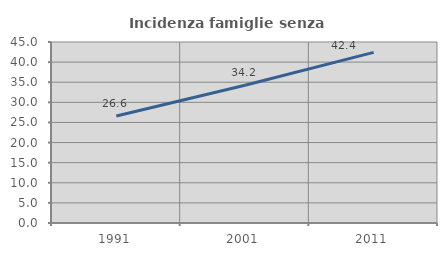
| Category | Incidenza famiglie senza nuclei |
|---|---|
| 1991.0 | 26.613 |
| 2001.0 | 34.228 |
| 2011.0 | 42.424 |